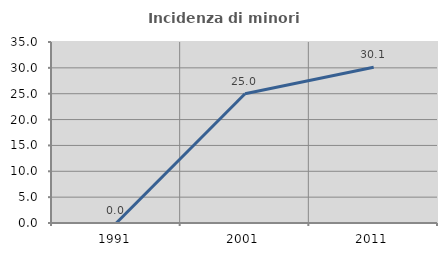
| Category | Incidenza di minori stranieri |
|---|---|
| 1991.0 | 0 |
| 2001.0 | 25 |
| 2011.0 | 30.12 |